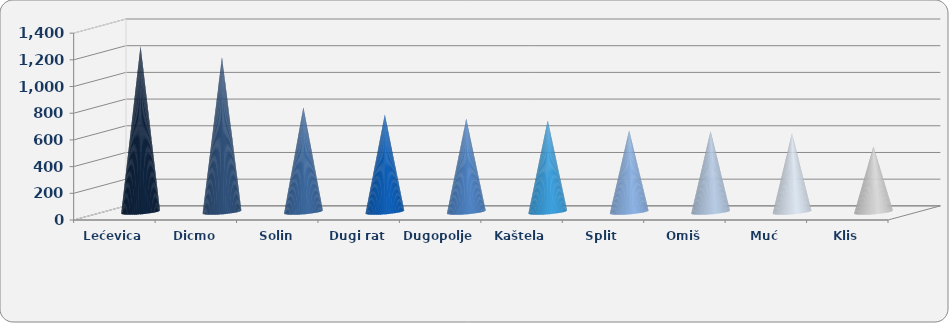
| Category | Produktivnost |
|---|---|
| Lećevica | 1243.261 |
| Dicmo | 1159.668 |
| Solin | 784.224 |
| Dugi rat | 731.321 |
| Dugopolje | 698.82 |
| Kaštela | 687.882 |
| Split | 611.626 |
| Omiš | 606.995 |
| Muć | 592.147 |
| Klis | 492.413 |